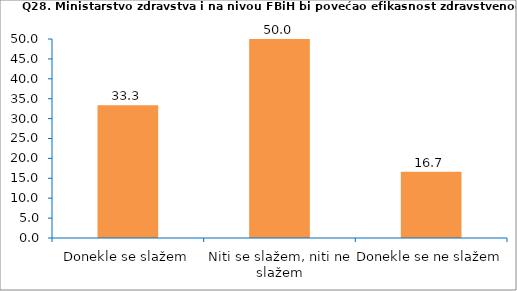
| Category | Series 0 |
|---|---|
| Donekle se slažem | 33.333 |
| Niti se slažem, niti ne slažem | 50 |
| Donekle se ne slažem | 16.667 |